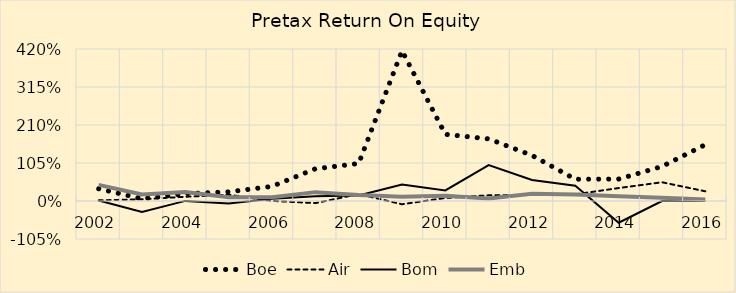
| Category | Boe | Air | Bom | Emb |
|---|---|---|---|---|
| 2002.0 | 0.339 | 0.017 | 0.014 | 0.445 |
| 2003.0 | 0.063 | 0.048 | -0.304 | 0.182 |
| 2004.0 | 0.202 | 0.117 | 0.003 | 0.248 |
| 2005.0 | 0.252 | 0.173 | -0.067 | 0.102 |
| 2006.0 | 0.404 | 0.003 | 0.064 | 0.103 |
| 2007.0 | 0.89 | -0.059 | 0.13 | 0.245 |
| 2008.0 | 1.036 | 0.191 | 0.15 | 0.167 |
| 2009.0 | 4.151 | -0.09 | 0.456 | 0.119 |
| 2010.0 | 1.842 | 0.084 | 0.293 | 0.144 |
| 2011.0 | 1.717 | 0.157 | 0.994 | 0.072 |
| 2012.0 | 1.26 | 0.17 | 0.579 | 0.199 |
| 2013.0 | 0.601 | 0.184 | 0.424 | 0.181 |
| 2014.0 | 0.606 | 0.358 | -0.6 | 0.131 |
| 2015.0 | 0.954 | 0.518 | 0 | 0.09 |
| 2016.0 | 1.557 | 0.268 | 0 | 0.041 |